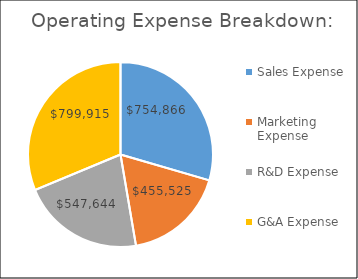
| Category | Series 0 |
|---|---|
| Sales Expense | 754865.625 |
| Marketing Expense | 455525 |
| R&D Expense | 547643.75 |
| G&A Expense | 799915 |